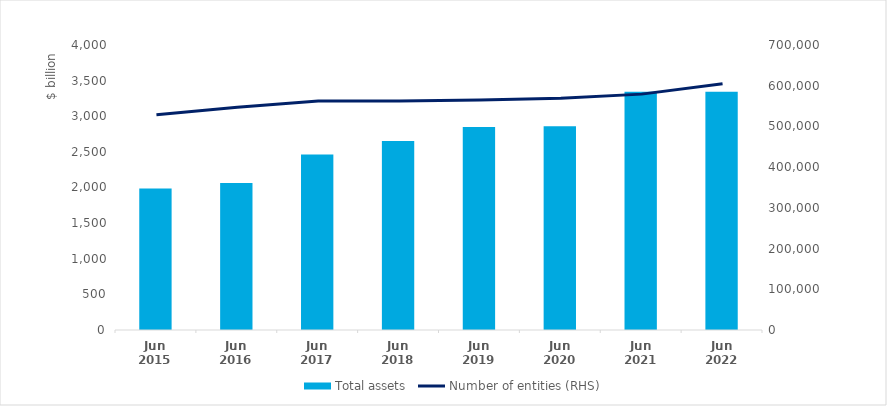
| Category | Total assets |
|---|---|
| Jun 2015 | 1985.7 |
| Jun 2016 | 2064.7 |
| Jun 2017 | 2462.1 |
| Jun 2018 | 2651.6 |
| Jun 2019 | 2849 |
| Jun 2020 | 2859.5 |
| Jun 2021 | 3345.1 |
| Jun 2022 | 3344.6 |